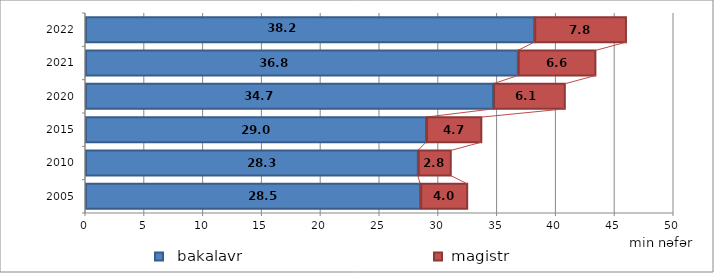
| Category |   bakalavr      |  magistr    |
|---|---|---|
| 2005.0 | 28.5 | 4 |
| 2010.0 | 28.3 | 2.8 |
| 2015.0 | 29 | 4.7 |
| 2020.0 | 34.7 | 6.1 |
| 2021.0 | 36.8 | 6.6 |
| 2022.0 | 38.2 | 7.8 |